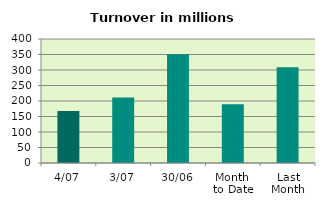
| Category | Series 0 |
|---|---|
| 4/07 | 167.424 |
| 3/07 | 211.073 |
| 30/06 | 351.101 |
| Month 
to Date | 189.249 |
| Last
Month | 308.534 |